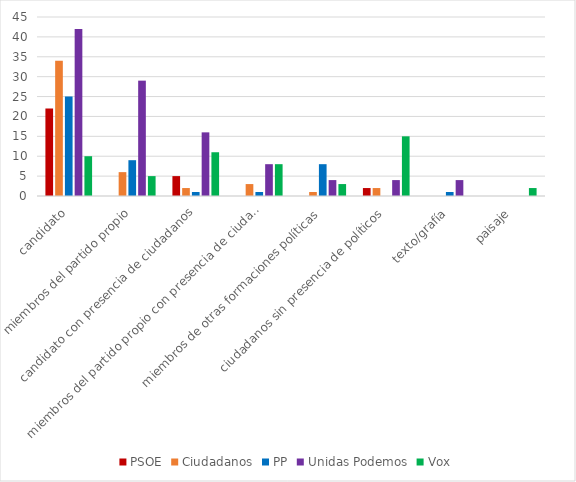
| Category | PSOE | Ciudadanos | PP | Unidas Podemos | Vox |
|---|---|---|---|---|---|
| candidato | 22 | 34 | 25 | 42 | 10 |
| miembros del partido propio | 0 | 6 | 9 | 29 | 5 |
| candidato con presencia de ciudadanos | 5 | 2 | 1 | 16 | 11 |
| miembros del partido propio con presencia de ciudadanos | 0 | 3 | 1 | 8 | 8 |
| miembros de otras formaciones políticas | 0 | 1 | 8 | 4 | 3 |
| ciudadanos sin presencia de políticos | 2 | 2 | 0 | 4 | 15 |
| texto/grafía | 0 | 0 | 1 | 4 | 0 |
| paisaje | 0 | 0 | 0 | 0 | 2 |